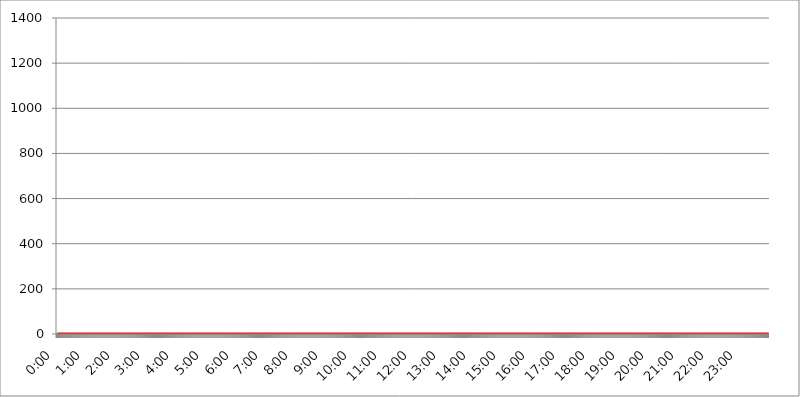
| Category | 2016.07.25. Intenzitás [W/m^2] |
|---|---|
| 0.0 | 0 |
| 0.0006944444444444445 | 0 |
| 0.001388888888888889 | 0 |
| 0.0020833333333333333 | 0 |
| 0.002777777777777778 | 0 |
| 0.003472222222222222 | 0 |
| 0.004166666666666667 | 0 |
| 0.004861111111111111 | 0 |
| 0.005555555555555556 | 0 |
| 0.0062499999999999995 | 0 |
| 0.006944444444444444 | 0 |
| 0.007638888888888889 | 0 |
| 0.008333333333333333 | 0 |
| 0.009027777777777779 | 0 |
| 0.009722222222222222 | 0 |
| 0.010416666666666666 | 0 |
| 0.011111111111111112 | 0 |
| 0.011805555555555555 | 0 |
| 0.012499999999999999 | 0 |
| 0.013194444444444444 | 0 |
| 0.013888888888888888 | 0 |
| 0.014583333333333332 | 0 |
| 0.015277777777777777 | 0 |
| 0.015972222222222224 | 0 |
| 0.016666666666666666 | 0 |
| 0.017361111111111112 | 0 |
| 0.018055555555555557 | 0 |
| 0.01875 | 0 |
| 0.019444444444444445 | 0 |
| 0.02013888888888889 | 0 |
| 0.020833333333333332 | 0 |
| 0.02152777777777778 | 0 |
| 0.022222222222222223 | 0 |
| 0.02291666666666667 | 0 |
| 0.02361111111111111 | 0 |
| 0.024305555555555556 | 0 |
| 0.024999999999999998 | 0 |
| 0.025694444444444447 | 0 |
| 0.02638888888888889 | 0 |
| 0.027083333333333334 | 0 |
| 0.027777777777777776 | 0 |
| 0.02847222222222222 | 0 |
| 0.029166666666666664 | 0 |
| 0.029861111111111113 | 0 |
| 0.030555555555555555 | 0 |
| 0.03125 | 0 |
| 0.03194444444444445 | 0 |
| 0.03263888888888889 | 0 |
| 0.03333333333333333 | 0 |
| 0.034027777777777775 | 0 |
| 0.034722222222222224 | 0 |
| 0.035416666666666666 | 0 |
| 0.036111111111111115 | 0 |
| 0.03680555555555556 | 0 |
| 0.0375 | 0 |
| 0.03819444444444444 | 0 |
| 0.03888888888888889 | 0 |
| 0.03958333333333333 | 0 |
| 0.04027777777777778 | 0 |
| 0.04097222222222222 | 0 |
| 0.041666666666666664 | 0 |
| 0.042361111111111106 | 0 |
| 0.04305555555555556 | 0 |
| 0.043750000000000004 | 0 |
| 0.044444444444444446 | 0 |
| 0.04513888888888889 | 0 |
| 0.04583333333333334 | 0 |
| 0.04652777777777778 | 0 |
| 0.04722222222222222 | 0 |
| 0.04791666666666666 | 0 |
| 0.04861111111111111 | 0 |
| 0.049305555555555554 | 0 |
| 0.049999999999999996 | 0 |
| 0.05069444444444445 | 0 |
| 0.051388888888888894 | 0 |
| 0.052083333333333336 | 0 |
| 0.05277777777777778 | 0 |
| 0.05347222222222222 | 0 |
| 0.05416666666666667 | 0 |
| 0.05486111111111111 | 0 |
| 0.05555555555555555 | 0 |
| 0.05625 | 0 |
| 0.05694444444444444 | 0 |
| 0.057638888888888885 | 0 |
| 0.05833333333333333 | 0 |
| 0.05902777777777778 | 0 |
| 0.059722222222222225 | 0 |
| 0.06041666666666667 | 0 |
| 0.061111111111111116 | 0 |
| 0.06180555555555556 | 0 |
| 0.0625 | 0 |
| 0.06319444444444444 | 0 |
| 0.06388888888888888 | 0 |
| 0.06458333333333334 | 0 |
| 0.06527777777777778 | 0 |
| 0.06597222222222222 | 0 |
| 0.06666666666666667 | 0 |
| 0.06736111111111111 | 0 |
| 0.06805555555555555 | 0 |
| 0.06874999999999999 | 0 |
| 0.06944444444444443 | 0 |
| 0.07013888888888889 | 0 |
| 0.07083333333333333 | 0 |
| 0.07152777777777779 | 0 |
| 0.07222222222222223 | 0 |
| 0.07291666666666667 | 0 |
| 0.07361111111111111 | 0 |
| 0.07430555555555556 | 0 |
| 0.075 | 0 |
| 0.07569444444444444 | 0 |
| 0.0763888888888889 | 0 |
| 0.07708333333333334 | 0 |
| 0.07777777777777778 | 0 |
| 0.07847222222222222 | 0 |
| 0.07916666666666666 | 0 |
| 0.0798611111111111 | 0 |
| 0.08055555555555556 | 0 |
| 0.08125 | 0 |
| 0.08194444444444444 | 0 |
| 0.08263888888888889 | 0 |
| 0.08333333333333333 | 0 |
| 0.08402777777777777 | 0 |
| 0.08472222222222221 | 0 |
| 0.08541666666666665 | 0 |
| 0.08611111111111112 | 0 |
| 0.08680555555555557 | 0 |
| 0.08750000000000001 | 0 |
| 0.08819444444444445 | 0 |
| 0.08888888888888889 | 0 |
| 0.08958333333333333 | 0 |
| 0.09027777777777778 | 0 |
| 0.09097222222222222 | 0 |
| 0.09166666666666667 | 0 |
| 0.09236111111111112 | 0 |
| 0.09305555555555556 | 0 |
| 0.09375 | 0 |
| 0.09444444444444444 | 0 |
| 0.09513888888888888 | 0 |
| 0.09583333333333333 | 0 |
| 0.09652777777777777 | 0 |
| 0.09722222222222222 | 0 |
| 0.09791666666666667 | 0 |
| 0.09861111111111111 | 0 |
| 0.09930555555555555 | 0 |
| 0.09999999999999999 | 0 |
| 0.10069444444444443 | 0 |
| 0.1013888888888889 | 0 |
| 0.10208333333333335 | 0 |
| 0.10277777777777779 | 0 |
| 0.10347222222222223 | 0 |
| 0.10416666666666667 | 0 |
| 0.10486111111111111 | 0 |
| 0.10555555555555556 | 0 |
| 0.10625 | 0 |
| 0.10694444444444444 | 0 |
| 0.1076388888888889 | 0 |
| 0.10833333333333334 | 0 |
| 0.10902777777777778 | 0 |
| 0.10972222222222222 | 0 |
| 0.1111111111111111 | 0 |
| 0.11180555555555556 | 0 |
| 0.11180555555555556 | 0 |
| 0.1125 | 0 |
| 0.11319444444444444 | 0 |
| 0.11388888888888889 | 0 |
| 0.11458333333333333 | 0 |
| 0.11527777777777777 | 0 |
| 0.11597222222222221 | 0 |
| 0.11666666666666665 | 0 |
| 0.1173611111111111 | 0 |
| 0.11805555555555557 | 0 |
| 0.11944444444444445 | 0 |
| 0.12013888888888889 | 0 |
| 0.12083333333333333 | 0 |
| 0.12152777777777778 | 0 |
| 0.12222222222222223 | 0 |
| 0.12291666666666667 | 0 |
| 0.12291666666666667 | 0 |
| 0.12361111111111112 | 0 |
| 0.12430555555555556 | 0 |
| 0.125 | 0 |
| 0.12569444444444444 | 0 |
| 0.12638888888888888 | 0 |
| 0.12708333333333333 | 0 |
| 0.16875 | 0 |
| 0.12847222222222224 | 0 |
| 0.12916666666666668 | 0 |
| 0.12986111111111112 | 0 |
| 0.13055555555555556 | 0 |
| 0.13125 | 0 |
| 0.13194444444444445 | 0 |
| 0.1326388888888889 | 0 |
| 0.13333333333333333 | 0 |
| 0.13402777777777777 | 0 |
| 0.13402777777777777 | 0 |
| 0.13472222222222222 | 0 |
| 0.13541666666666666 | 0 |
| 0.1361111111111111 | 0 |
| 0.13749999999999998 | 0 |
| 0.13819444444444443 | 0 |
| 0.1388888888888889 | 0 |
| 0.13958333333333334 | 0 |
| 0.14027777777777778 | 0 |
| 0.14097222222222222 | 0 |
| 0.14166666666666666 | 0 |
| 0.1423611111111111 | 0 |
| 0.14305555555555557 | 0 |
| 0.14375000000000002 | 0 |
| 0.14444444444444446 | 0 |
| 0.1451388888888889 | 0 |
| 0.1451388888888889 | 0 |
| 0.14652777777777778 | 0 |
| 0.14722222222222223 | 0 |
| 0.14791666666666667 | 0 |
| 0.1486111111111111 | 0 |
| 0.14930555555555555 | 0 |
| 0.15 | 0 |
| 0.15069444444444444 | 0 |
| 0.15138888888888888 | 0 |
| 0.15208333333333332 | 0 |
| 0.15277777777777776 | 0 |
| 0.15347222222222223 | 0 |
| 0.15416666666666667 | 0 |
| 0.15486111111111112 | 0 |
| 0.15555555555555556 | 0 |
| 0.15625 | 0 |
| 0.15694444444444444 | 0 |
| 0.15763888888888888 | 0 |
| 0.15833333333333333 | 0 |
| 0.15902777777777777 | 0 |
| 0.15972222222222224 | 0 |
| 0.16041666666666668 | 0 |
| 0.16111111111111112 | 0 |
| 0.16180555555555556 | 0 |
| 0.1625 | 0 |
| 0.16319444444444445 | 0 |
| 0.1638888888888889 | 0 |
| 0.16458333333333333 | 0 |
| 0.16527777777777777 | 0 |
| 0.16597222222222222 | 0 |
| 0.16666666666666666 | 0 |
| 0.1673611111111111 | 0 |
| 0.16805555555555554 | 0 |
| 0.16874999999999998 | 0 |
| 0.16944444444444443 | 0 |
| 0.17013888888888887 | 0 |
| 0.1708333333333333 | 0 |
| 0.17152777777777775 | 0 |
| 0.17222222222222225 | 0 |
| 0.1729166666666667 | 0 |
| 0.17361111111111113 | 0 |
| 0.17430555555555557 | 0 |
| 0.17500000000000002 | 0 |
| 0.17569444444444446 | 0 |
| 0.1763888888888889 | 0 |
| 0.17708333333333334 | 0 |
| 0.17777777777777778 | 0 |
| 0.17847222222222223 | 0 |
| 0.17916666666666667 | 0 |
| 0.1798611111111111 | 0 |
| 0.18055555555555555 | 0 |
| 0.18125 | 0 |
| 0.18194444444444444 | 0 |
| 0.1826388888888889 | 0 |
| 0.18333333333333335 | 0 |
| 0.1840277777777778 | 0 |
| 0.18472222222222223 | 0 |
| 0.18541666666666667 | 0 |
| 0.18611111111111112 | 0 |
| 0.18680555555555556 | 0 |
| 0.1875 | 0 |
| 0.18819444444444444 | 0 |
| 0.18888888888888888 | 0 |
| 0.18958333333333333 | 0 |
| 0.19027777777777777 | 0 |
| 0.1909722222222222 | 0 |
| 0.19166666666666665 | 0 |
| 0.19236111111111112 | 0 |
| 0.19305555555555554 | 0 |
| 0.19375 | 0 |
| 0.19444444444444445 | 0 |
| 0.1951388888888889 | 0 |
| 0.19583333333333333 | 0 |
| 0.19652777777777777 | 0 |
| 0.19722222222222222 | 0 |
| 0.19791666666666666 | 0 |
| 0.1986111111111111 | 0 |
| 0.19930555555555554 | 0 |
| 0.19999999999999998 | 0 |
| 0.20069444444444443 | 0 |
| 0.20138888888888887 | 0 |
| 0.2020833333333333 | 0 |
| 0.2027777777777778 | 0 |
| 0.2034722222222222 | 0 |
| 0.2041666666666667 | 0 |
| 0.20486111111111113 | 0 |
| 0.20555555555555557 | 0 |
| 0.20625000000000002 | 0 |
| 0.20694444444444446 | 0 |
| 0.2076388888888889 | 0 |
| 0.20833333333333334 | 0 |
| 0.20902777777777778 | 0 |
| 0.20972222222222223 | 0 |
| 0.21041666666666667 | 0 |
| 0.2111111111111111 | 0 |
| 0.21180555555555555 | 0 |
| 0.2125 | 0 |
| 0.21319444444444444 | 0 |
| 0.2138888888888889 | 0 |
| 0.21458333333333335 | 0 |
| 0.2152777777777778 | 0 |
| 0.21597222222222223 | 0 |
| 0.21666666666666667 | 0 |
| 0.21736111111111112 | 0 |
| 0.21805555555555556 | 0 |
| 0.21875 | 0 |
| 0.21944444444444444 | 0 |
| 0.22013888888888888 | 0 |
| 0.22083333333333333 | 0 |
| 0.22152777777777777 | 0 |
| 0.2222222222222222 | 0 |
| 0.22291666666666665 | 0 |
| 0.2236111111111111 | 0 |
| 0.22430555555555556 | 0 |
| 0.225 | 0 |
| 0.22569444444444445 | 0 |
| 0.2263888888888889 | 0 |
| 0.22708333333333333 | 0 |
| 0.22777777777777777 | 0 |
| 0.22847222222222222 | 0 |
| 0.22916666666666666 | 0 |
| 0.2298611111111111 | 0 |
| 0.23055555555555554 | 0 |
| 0.23124999999999998 | 0 |
| 0.23194444444444443 | 0 |
| 0.23263888888888887 | 0 |
| 0.2333333333333333 | 0 |
| 0.2340277777777778 | 0 |
| 0.2347222222222222 | 0 |
| 0.2354166666666667 | 0 |
| 0.23611111111111113 | 0 |
| 0.23680555555555557 | 0 |
| 0.23750000000000002 | 0 |
| 0.23819444444444446 | 0 |
| 0.2388888888888889 | 0 |
| 0.23958333333333334 | 0 |
| 0.24027777777777778 | 0 |
| 0.24097222222222223 | 0 |
| 0.24166666666666667 | 0 |
| 0.2423611111111111 | 0 |
| 0.24305555555555555 | 0 |
| 0.24375 | 0 |
| 0.24444444444444446 | 0 |
| 0.24513888888888888 | 0 |
| 0.24583333333333335 | 0 |
| 0.2465277777777778 | 0 |
| 0.24722222222222223 | 0 |
| 0.24791666666666667 | 0 |
| 0.24861111111111112 | 0 |
| 0.24930555555555556 | 0 |
| 0.25 | 0 |
| 0.25069444444444444 | 0 |
| 0.2513888888888889 | 0 |
| 0.2520833333333333 | 0 |
| 0.25277777777777777 | 0 |
| 0.2534722222222222 | 0 |
| 0.25416666666666665 | 0 |
| 0.2548611111111111 | 0 |
| 0.2555555555555556 | 0 |
| 0.25625000000000003 | 0 |
| 0.2569444444444445 | 0 |
| 0.2576388888888889 | 0 |
| 0.25833333333333336 | 0 |
| 0.2590277777777778 | 0 |
| 0.25972222222222224 | 0 |
| 0.2604166666666667 | 0 |
| 0.2611111111111111 | 0 |
| 0.26180555555555557 | 0 |
| 0.2625 | 0 |
| 0.26319444444444445 | 0 |
| 0.2638888888888889 | 0 |
| 0.26458333333333334 | 0 |
| 0.2652777777777778 | 0 |
| 0.2659722222222222 | 0 |
| 0.26666666666666666 | 0 |
| 0.2673611111111111 | 0 |
| 0.26805555555555555 | 0 |
| 0.26875 | 0 |
| 0.26944444444444443 | 0 |
| 0.2701388888888889 | 0 |
| 0.2708333333333333 | 0 |
| 0.27152777777777776 | 0 |
| 0.2722222222222222 | 0 |
| 0.27291666666666664 | 0 |
| 0.2736111111111111 | 0 |
| 0.2743055555555555 | 0 |
| 0.27499999999999997 | 0 |
| 0.27569444444444446 | 0 |
| 0.27638888888888885 | 0 |
| 0.27708333333333335 | 0 |
| 0.2777777777777778 | 0 |
| 0.27847222222222223 | 0 |
| 0.2791666666666667 | 0 |
| 0.2798611111111111 | 0 |
| 0.28055555555555556 | 0 |
| 0.28125 | 0 |
| 0.28194444444444444 | 0 |
| 0.2826388888888889 | 0 |
| 0.2833333333333333 | 0 |
| 0.28402777777777777 | 0 |
| 0.2847222222222222 | 0 |
| 0.28541666666666665 | 0 |
| 0.28611111111111115 | 0 |
| 0.28680555555555554 | 0 |
| 0.28750000000000003 | 0 |
| 0.2881944444444445 | 0 |
| 0.2888888888888889 | 0 |
| 0.28958333333333336 | 0 |
| 0.2902777777777778 | 0 |
| 0.29097222222222224 | 0 |
| 0.2916666666666667 | 0 |
| 0.2923611111111111 | 0 |
| 0.29305555555555557 | 0 |
| 0.29375 | 0 |
| 0.29444444444444445 | 0 |
| 0.2951388888888889 | 0 |
| 0.29583333333333334 | 0 |
| 0.2965277777777778 | 0 |
| 0.2972222222222222 | 0 |
| 0.29791666666666666 | 0 |
| 0.2986111111111111 | 0 |
| 0.29930555555555555 | 0 |
| 0.3 | 0 |
| 0.30069444444444443 | 0 |
| 0.3013888888888889 | 0 |
| 0.3020833333333333 | 0 |
| 0.30277777777777776 | 0 |
| 0.3034722222222222 | 0 |
| 0.30416666666666664 | 0 |
| 0.3048611111111111 | 0 |
| 0.3055555555555555 | 0 |
| 0.30624999999999997 | 0 |
| 0.3069444444444444 | 0 |
| 0.3076388888888889 | 0 |
| 0.30833333333333335 | 0 |
| 0.3090277777777778 | 0 |
| 0.30972222222222223 | 0 |
| 0.3104166666666667 | 0 |
| 0.3111111111111111 | 0 |
| 0.31180555555555556 | 0 |
| 0.3125 | 0 |
| 0.31319444444444444 | 0 |
| 0.3138888888888889 | 0 |
| 0.3145833333333333 | 0 |
| 0.31527777777777777 | 0 |
| 0.3159722222222222 | 0 |
| 0.31666666666666665 | 0 |
| 0.31736111111111115 | 0 |
| 0.31805555555555554 | 0 |
| 0.31875000000000003 | 0 |
| 0.3194444444444445 | 0 |
| 0.3201388888888889 | 0 |
| 0.32083333333333336 | 0 |
| 0.3215277777777778 | 0 |
| 0.32222222222222224 | 0 |
| 0.3229166666666667 | 0 |
| 0.3236111111111111 | 0 |
| 0.32430555555555557 | 0 |
| 0.325 | 0 |
| 0.32569444444444445 | 0 |
| 0.3263888888888889 | 0 |
| 0.32708333333333334 | 0 |
| 0.3277777777777778 | 0 |
| 0.3284722222222222 | 0 |
| 0.32916666666666666 | 0 |
| 0.3298611111111111 | 0 |
| 0.33055555555555555 | 0 |
| 0.33125 | 0 |
| 0.33194444444444443 | 0 |
| 0.3326388888888889 | 0 |
| 0.3333333333333333 | 0 |
| 0.3340277777777778 | 0 |
| 0.3347222222222222 | 0 |
| 0.3354166666666667 | 0 |
| 0.3361111111111111 | 0 |
| 0.3368055555555556 | 0 |
| 0.33749999999999997 | 0 |
| 0.33819444444444446 | 0 |
| 0.33888888888888885 | 0 |
| 0.33958333333333335 | 0 |
| 0.34027777777777773 | 0 |
| 0.34097222222222223 | 0 |
| 0.3416666666666666 | 0 |
| 0.3423611111111111 | 0 |
| 0.3430555555555555 | 0 |
| 0.34375 | 0 |
| 0.3444444444444445 | 0 |
| 0.3451388888888889 | 0 |
| 0.3458333333333334 | 0 |
| 0.34652777777777777 | 0 |
| 0.34722222222222227 | 0 |
| 0.34791666666666665 | 0 |
| 0.34861111111111115 | 0 |
| 0.34930555555555554 | 0 |
| 0.35000000000000003 | 0 |
| 0.3506944444444444 | 0 |
| 0.3513888888888889 | 0 |
| 0.3520833333333333 | 0 |
| 0.3527777777777778 | 0 |
| 0.3534722222222222 | 0 |
| 0.3541666666666667 | 0 |
| 0.3548611111111111 | 0 |
| 0.35555555555555557 | 0 |
| 0.35625 | 0 |
| 0.35694444444444445 | 0 |
| 0.3576388888888889 | 0 |
| 0.35833333333333334 | 0 |
| 0.3590277777777778 | 0 |
| 0.3597222222222222 | 0 |
| 0.36041666666666666 | 0 |
| 0.3611111111111111 | 0 |
| 0.36180555555555555 | 0 |
| 0.3625 | 0 |
| 0.36319444444444443 | 0 |
| 0.3638888888888889 | 0 |
| 0.3645833333333333 | 0 |
| 0.3652777777777778 | 0 |
| 0.3659722222222222 | 0 |
| 0.3666666666666667 | 0 |
| 0.3673611111111111 | 0 |
| 0.3680555555555556 | 0 |
| 0.36874999999999997 | 0 |
| 0.36944444444444446 | 0 |
| 0.37013888888888885 | 0 |
| 0.37083333333333335 | 0 |
| 0.37152777777777773 | 0 |
| 0.37222222222222223 | 0 |
| 0.3729166666666666 | 0 |
| 0.3736111111111111 | 0 |
| 0.3743055555555555 | 0 |
| 0.375 | 0 |
| 0.3756944444444445 | 0 |
| 0.3763888888888889 | 0 |
| 0.3770833333333334 | 0 |
| 0.37777777777777777 | 0 |
| 0.37847222222222227 | 0 |
| 0.37916666666666665 | 0 |
| 0.37986111111111115 | 0 |
| 0.38055555555555554 | 0 |
| 0.38125000000000003 | 0 |
| 0.3819444444444444 | 0 |
| 0.3826388888888889 | 0 |
| 0.3833333333333333 | 0 |
| 0.3840277777777778 | 0 |
| 0.3847222222222222 | 0 |
| 0.3854166666666667 | 0 |
| 0.3861111111111111 | 0 |
| 0.38680555555555557 | 0 |
| 0.3875 | 0 |
| 0.38819444444444445 | 0 |
| 0.3888888888888889 | 0 |
| 0.38958333333333334 | 0 |
| 0.3902777777777778 | 0 |
| 0.3909722222222222 | 0 |
| 0.39166666666666666 | 0 |
| 0.3923611111111111 | 0 |
| 0.39305555555555555 | 0 |
| 0.39375 | 0 |
| 0.39444444444444443 | 0 |
| 0.3951388888888889 | 0 |
| 0.3958333333333333 | 0 |
| 0.3965277777777778 | 0 |
| 0.3972222222222222 | 0 |
| 0.3979166666666667 | 0 |
| 0.3986111111111111 | 0 |
| 0.3993055555555556 | 0 |
| 0.39999999999999997 | 0 |
| 0.40069444444444446 | 0 |
| 0.40138888888888885 | 0 |
| 0.40208333333333335 | 0 |
| 0.40277777777777773 | 0 |
| 0.40347222222222223 | 0 |
| 0.4041666666666666 | 0 |
| 0.4048611111111111 | 0 |
| 0.4055555555555555 | 0 |
| 0.40625 | 0 |
| 0.4069444444444445 | 0 |
| 0.4076388888888889 | 0 |
| 0.4083333333333334 | 0 |
| 0.40902777777777777 | 0 |
| 0.40972222222222227 | 0 |
| 0.41041666666666665 | 0 |
| 0.41111111111111115 | 0 |
| 0.41180555555555554 | 0 |
| 0.41250000000000003 | 0 |
| 0.4131944444444444 | 0 |
| 0.4138888888888889 | 0 |
| 0.4145833333333333 | 0 |
| 0.4152777777777778 | 0 |
| 0.4159722222222222 | 0 |
| 0.4166666666666667 | 0 |
| 0.4173611111111111 | 0 |
| 0.41805555555555557 | 0 |
| 0.41875 | 0 |
| 0.41944444444444445 | 0 |
| 0.4201388888888889 | 0 |
| 0.42083333333333334 | 0 |
| 0.4215277777777778 | 0 |
| 0.4222222222222222 | 0 |
| 0.42291666666666666 | 0 |
| 0.4236111111111111 | 0 |
| 0.42430555555555555 | 0 |
| 0.425 | 0 |
| 0.42569444444444443 | 0 |
| 0.4263888888888889 | 0 |
| 0.4270833333333333 | 0 |
| 0.4277777777777778 | 0 |
| 0.4284722222222222 | 0 |
| 0.4291666666666667 | 0 |
| 0.4298611111111111 | 0 |
| 0.4305555555555556 | 0 |
| 0.43124999999999997 | 0 |
| 0.43194444444444446 | 0 |
| 0.43263888888888885 | 0 |
| 0.43333333333333335 | 0 |
| 0.43402777777777773 | 0 |
| 0.43472222222222223 | 0 |
| 0.4354166666666666 | 0 |
| 0.4361111111111111 | 0 |
| 0.4368055555555555 | 0 |
| 0.4375 | 0 |
| 0.4381944444444445 | 0 |
| 0.4388888888888889 | 0 |
| 0.4395833333333334 | 0 |
| 0.44027777777777777 | 0 |
| 0.44097222222222227 | 0 |
| 0.44166666666666665 | 0 |
| 0.44236111111111115 | 0 |
| 0.44305555555555554 | 0 |
| 0.44375000000000003 | 0 |
| 0.4444444444444444 | 0 |
| 0.4451388888888889 | 0 |
| 0.4458333333333333 | 0 |
| 0.4465277777777778 | 0 |
| 0.4472222222222222 | 0 |
| 0.4479166666666667 | 0 |
| 0.4486111111111111 | 0 |
| 0.44930555555555557 | 0 |
| 0.45 | 0 |
| 0.45069444444444445 | 0 |
| 0.4513888888888889 | 0 |
| 0.45208333333333334 | 0 |
| 0.4527777777777778 | 0 |
| 0.4534722222222222 | 0 |
| 0.45416666666666666 | 0 |
| 0.4548611111111111 | 0 |
| 0.45555555555555555 | 0 |
| 0.45625 | 0 |
| 0.45694444444444443 | 0 |
| 0.4576388888888889 | 0 |
| 0.4583333333333333 | 0 |
| 0.4590277777777778 | 0 |
| 0.4597222222222222 | 0 |
| 0.4604166666666667 | 0 |
| 0.4611111111111111 | 0 |
| 0.4618055555555556 | 0 |
| 0.46249999999999997 | 0 |
| 0.46319444444444446 | 0 |
| 0.46388888888888885 | 0 |
| 0.46458333333333335 | 0 |
| 0.46527777777777773 | 0 |
| 0.46597222222222223 | 0 |
| 0.4666666666666666 | 0 |
| 0.4673611111111111 | 0 |
| 0.4680555555555555 | 0 |
| 0.46875 | 0 |
| 0.4694444444444445 | 0 |
| 0.4701388888888889 | 0 |
| 0.4708333333333334 | 0 |
| 0.47152777777777777 | 0 |
| 0.47222222222222227 | 0 |
| 0.47291666666666665 | 0 |
| 0.47361111111111115 | 0 |
| 0.47430555555555554 | 0 |
| 0.47500000000000003 | 0 |
| 0.4756944444444444 | 0 |
| 0.4763888888888889 | 0 |
| 0.4770833333333333 | 0 |
| 0.4777777777777778 | 0 |
| 0.4784722222222222 | 0 |
| 0.4791666666666667 | 0 |
| 0.4798611111111111 | 0 |
| 0.48055555555555557 | 0 |
| 0.48125 | 0 |
| 0.48194444444444445 | 0 |
| 0.4826388888888889 | 0 |
| 0.48333333333333334 | 0 |
| 0.4840277777777778 | 0 |
| 0.4847222222222222 | 0 |
| 0.48541666666666666 | 0 |
| 0.4861111111111111 | 0 |
| 0.48680555555555555 | 0 |
| 0.4875 | 0 |
| 0.48819444444444443 | 0 |
| 0.4888888888888889 | 0 |
| 0.4895833333333333 | 0 |
| 0.4902777777777778 | 0 |
| 0.4909722222222222 | 0 |
| 0.4916666666666667 | 0 |
| 0.4923611111111111 | 0 |
| 0.4930555555555556 | 0 |
| 0.49374999999999997 | 0 |
| 0.49444444444444446 | 0 |
| 0.49513888888888885 | 0 |
| 0.49583333333333335 | 0 |
| 0.49652777777777773 | 0 |
| 0.49722222222222223 | 0 |
| 0.4979166666666666 | 0 |
| 0.4986111111111111 | 0 |
| 0.4993055555555555 | 0 |
| 0.5 | 0 |
| 0.5006944444444444 | 0 |
| 0.5013888888888889 | 0 |
| 0.5020833333333333 | 0 |
| 0.5027777777777778 | 0 |
| 0.5034722222222222 | 0 |
| 0.5041666666666667 | 0 |
| 0.5048611111111111 | 0 |
| 0.5055555555555555 | 0 |
| 0.50625 | 0 |
| 0.5069444444444444 | 0 |
| 0.5076388888888889 | 0 |
| 0.5083333333333333 | 0 |
| 0.5090277777777777 | 0 |
| 0.5097222222222222 | 0 |
| 0.5104166666666666 | 0 |
| 0.5111111111111112 | 0 |
| 0.5118055555555555 | 0 |
| 0.5125000000000001 | 0 |
| 0.5131944444444444 | 0 |
| 0.513888888888889 | 0 |
| 0.5145833333333333 | 0 |
| 0.5152777777777778 | 0 |
| 0.5159722222222222 | 0 |
| 0.5166666666666667 | 0 |
| 0.517361111111111 | 0 |
| 0.5180555555555556 | 0 |
| 0.5187499999999999 | 0 |
| 0.5194444444444445 | 0 |
| 0.5201388888888888 | 0 |
| 0.5208333333333334 | 0 |
| 0.5215277777777778 | 0 |
| 0.5222222222222223 | 0 |
| 0.5229166666666667 | 0 |
| 0.5236111111111111 | 0 |
| 0.5243055555555556 | 0 |
| 0.525 | 0 |
| 0.5256944444444445 | 0 |
| 0.5263888888888889 | 0 |
| 0.5270833333333333 | 0 |
| 0.5277777777777778 | 0 |
| 0.5284722222222222 | 0 |
| 0.5291666666666667 | 0 |
| 0.5298611111111111 | 0 |
| 0.5305555555555556 | 0 |
| 0.53125 | 0 |
| 0.5319444444444444 | 0 |
| 0.5326388888888889 | 0 |
| 0.5333333333333333 | 0 |
| 0.5340277777777778 | 0 |
| 0.5347222222222222 | 0 |
| 0.5354166666666667 | 0 |
| 0.5361111111111111 | 0 |
| 0.5368055555555555 | 0 |
| 0.5375 | 0 |
| 0.5381944444444444 | 0 |
| 0.5388888888888889 | 0 |
| 0.5395833333333333 | 0 |
| 0.5402777777777777 | 0 |
| 0.5409722222222222 | 0 |
| 0.5416666666666666 | 0 |
| 0.5423611111111112 | 0 |
| 0.5430555555555555 | 0 |
| 0.5437500000000001 | 0 |
| 0.5444444444444444 | 0 |
| 0.545138888888889 | 0 |
| 0.5458333333333333 | 0 |
| 0.5465277777777778 | 0 |
| 0.5472222222222222 | 0 |
| 0.5479166666666667 | 0 |
| 0.548611111111111 | 0 |
| 0.5493055555555556 | 0 |
| 0.5499999999999999 | 0 |
| 0.5506944444444445 | 0 |
| 0.5513888888888888 | 0 |
| 0.5520833333333334 | 0 |
| 0.5527777777777778 | 0 |
| 0.5534722222222223 | 0 |
| 0.5541666666666667 | 0 |
| 0.5548611111111111 | 0 |
| 0.5555555555555556 | 0 |
| 0.55625 | 0 |
| 0.5569444444444445 | 0 |
| 0.5576388888888889 | 0 |
| 0.5583333333333333 | 0 |
| 0.5590277777777778 | 0 |
| 0.5597222222222222 | 0 |
| 0.5604166666666667 | 0 |
| 0.5611111111111111 | 0 |
| 0.5618055555555556 | 0 |
| 0.5625 | 0 |
| 0.5631944444444444 | 0 |
| 0.5638888888888889 | 0 |
| 0.5645833333333333 | 0 |
| 0.5652777777777778 | 0 |
| 0.5659722222222222 | 0 |
| 0.5666666666666667 | 0 |
| 0.5673611111111111 | 0 |
| 0.5680555555555555 | 0 |
| 0.56875 | 0 |
| 0.5694444444444444 | 0 |
| 0.5701388888888889 | 0 |
| 0.5708333333333333 | 0 |
| 0.5715277777777777 | 0 |
| 0.5722222222222222 | 0 |
| 0.5729166666666666 | 0 |
| 0.5736111111111112 | 0 |
| 0.5743055555555555 | 0 |
| 0.5750000000000001 | 0 |
| 0.5756944444444444 | 0 |
| 0.576388888888889 | 0 |
| 0.5770833333333333 | 0 |
| 0.5777777777777778 | 0 |
| 0.5784722222222222 | 0 |
| 0.5791666666666667 | 0 |
| 0.579861111111111 | 0 |
| 0.5805555555555556 | 0 |
| 0.5812499999999999 | 0 |
| 0.5819444444444445 | 0 |
| 0.5826388888888888 | 0 |
| 0.5833333333333334 | 0 |
| 0.5840277777777778 | 0 |
| 0.5847222222222223 | 0 |
| 0.5854166666666667 | 0 |
| 0.5861111111111111 | 0 |
| 0.5868055555555556 | 0 |
| 0.5875 | 0 |
| 0.5881944444444445 | 0 |
| 0.5888888888888889 | 0 |
| 0.5895833333333333 | 0 |
| 0.5902777777777778 | 0 |
| 0.5909722222222222 | 0 |
| 0.5916666666666667 | 0 |
| 0.5923611111111111 | 0 |
| 0.5930555555555556 | 0 |
| 0.59375 | 0 |
| 0.5944444444444444 | 0 |
| 0.5951388888888889 | 0 |
| 0.5958333333333333 | 0 |
| 0.5965277777777778 | 0 |
| 0.5972222222222222 | 0 |
| 0.5979166666666667 | 0 |
| 0.5986111111111111 | 0 |
| 0.5993055555555555 | 0 |
| 0.6 | 0 |
| 0.6006944444444444 | 0 |
| 0.6013888888888889 | 0 |
| 0.6020833333333333 | 0 |
| 0.6027777777777777 | 0 |
| 0.6034722222222222 | 0 |
| 0.6041666666666666 | 0 |
| 0.6048611111111112 | 0 |
| 0.6055555555555555 | 0 |
| 0.6062500000000001 | 0 |
| 0.6069444444444444 | 0 |
| 0.607638888888889 | 0 |
| 0.6083333333333333 | 0 |
| 0.6090277777777778 | 0 |
| 0.6097222222222222 | 0 |
| 0.6104166666666667 | 0 |
| 0.611111111111111 | 0 |
| 0.6118055555555556 | 0 |
| 0.6124999999999999 | 0 |
| 0.6131944444444445 | 0 |
| 0.6138888888888888 | 0 |
| 0.6145833333333334 | 0 |
| 0.6152777777777778 | 0 |
| 0.6159722222222223 | 0 |
| 0.6166666666666667 | 0 |
| 0.6173611111111111 | 0 |
| 0.6180555555555556 | 0 |
| 0.61875 | 0 |
| 0.6194444444444445 | 0 |
| 0.6201388888888889 | 0 |
| 0.6208333333333333 | 0 |
| 0.6215277777777778 | 0 |
| 0.6222222222222222 | 0 |
| 0.6229166666666667 | 0 |
| 0.6236111111111111 | 0 |
| 0.6243055555555556 | 0 |
| 0.625 | 0 |
| 0.6256944444444444 | 0 |
| 0.6263888888888889 | 0 |
| 0.6270833333333333 | 0 |
| 0.6277777777777778 | 0 |
| 0.6284722222222222 | 0 |
| 0.6291666666666667 | 0 |
| 0.6298611111111111 | 0 |
| 0.6305555555555555 | 0 |
| 0.63125 | 0 |
| 0.6319444444444444 | 0 |
| 0.6326388888888889 | 0 |
| 0.6333333333333333 | 0 |
| 0.6340277777777777 | 0 |
| 0.6347222222222222 | 0 |
| 0.6354166666666666 | 0 |
| 0.6361111111111112 | 0 |
| 0.6368055555555555 | 0 |
| 0.6375000000000001 | 0 |
| 0.6381944444444444 | 0 |
| 0.638888888888889 | 0 |
| 0.6395833333333333 | 0 |
| 0.6402777777777778 | 0 |
| 0.6409722222222222 | 0 |
| 0.6416666666666667 | 0 |
| 0.642361111111111 | 0 |
| 0.6430555555555556 | 0 |
| 0.6437499999999999 | 0 |
| 0.6444444444444445 | 0 |
| 0.6451388888888888 | 0 |
| 0.6458333333333334 | 0 |
| 0.6465277777777778 | 0 |
| 0.6472222222222223 | 0 |
| 0.6479166666666667 | 0 |
| 0.6486111111111111 | 0 |
| 0.6493055555555556 | 0 |
| 0.65 | 0 |
| 0.6506944444444445 | 0 |
| 0.6513888888888889 | 0 |
| 0.6520833333333333 | 0 |
| 0.6527777777777778 | 0 |
| 0.6534722222222222 | 0 |
| 0.6541666666666667 | 0 |
| 0.6548611111111111 | 0 |
| 0.6555555555555556 | 0 |
| 0.65625 | 0 |
| 0.6569444444444444 | 0 |
| 0.6576388888888889 | 0 |
| 0.6583333333333333 | 0 |
| 0.6590277777777778 | 0 |
| 0.6597222222222222 | 0 |
| 0.6604166666666667 | 0 |
| 0.6611111111111111 | 0 |
| 0.6618055555555555 | 0 |
| 0.6625 | 0 |
| 0.6631944444444444 | 0 |
| 0.6638888888888889 | 0 |
| 0.6645833333333333 | 0 |
| 0.6652777777777777 | 0 |
| 0.6659722222222222 | 0 |
| 0.6666666666666666 | 0 |
| 0.6673611111111111 | 0 |
| 0.6680555555555556 | 0 |
| 0.6687500000000001 | 0 |
| 0.6694444444444444 | 0 |
| 0.6701388888888888 | 0 |
| 0.6708333333333334 | 0 |
| 0.6715277777777778 | 0 |
| 0.6722222222222222 | 0 |
| 0.6729166666666666 | 0 |
| 0.6736111111111112 | 0 |
| 0.6743055555555556 | 0 |
| 0.6749999999999999 | 0 |
| 0.6756944444444444 | 0 |
| 0.6763888888888889 | 0 |
| 0.6770833333333334 | 0 |
| 0.6777777777777777 | 0 |
| 0.6784722222222223 | 0 |
| 0.6791666666666667 | 0 |
| 0.6798611111111111 | 0 |
| 0.6805555555555555 | 0 |
| 0.68125 | 0 |
| 0.6819444444444445 | 0 |
| 0.6826388888888889 | 0 |
| 0.6833333333333332 | 0 |
| 0.6840277777777778 | 0 |
| 0.6847222222222222 | 0 |
| 0.6854166666666667 | 0 |
| 0.686111111111111 | 0 |
| 0.6868055555555556 | 0 |
| 0.6875 | 0 |
| 0.6881944444444444 | 0 |
| 0.688888888888889 | 0 |
| 0.6895833333333333 | 0 |
| 0.6902777777777778 | 0 |
| 0.6909722222222222 | 0 |
| 0.6916666666666668 | 0 |
| 0.6923611111111111 | 0 |
| 0.6930555555555555 | 0 |
| 0.69375 | 0 |
| 0.6944444444444445 | 0 |
| 0.6951388888888889 | 0 |
| 0.6958333333333333 | 0 |
| 0.6965277777777777 | 0 |
| 0.6972222222222223 | 0 |
| 0.6979166666666666 | 0 |
| 0.6986111111111111 | 0 |
| 0.6993055555555556 | 0 |
| 0.7000000000000001 | 0 |
| 0.7006944444444444 | 0 |
| 0.7013888888888888 | 0 |
| 0.7020833333333334 | 0 |
| 0.7027777777777778 | 0 |
| 0.7034722222222222 | 0 |
| 0.7041666666666666 | 0 |
| 0.7048611111111112 | 0 |
| 0.7055555555555556 | 0 |
| 0.7062499999999999 | 0 |
| 0.7069444444444444 | 0 |
| 0.7076388888888889 | 0 |
| 0.7083333333333334 | 0 |
| 0.7090277777777777 | 0 |
| 0.7097222222222223 | 0 |
| 0.7104166666666667 | 0 |
| 0.7111111111111111 | 0 |
| 0.7118055555555555 | 0 |
| 0.7125 | 0 |
| 0.7131944444444445 | 0 |
| 0.7138888888888889 | 0 |
| 0.7145833333333332 | 0 |
| 0.7152777777777778 | 0 |
| 0.7159722222222222 | 0 |
| 0.7166666666666667 | 0 |
| 0.717361111111111 | 0 |
| 0.7180555555555556 | 0 |
| 0.71875 | 0 |
| 0.7194444444444444 | 0 |
| 0.720138888888889 | 0 |
| 0.7208333333333333 | 0 |
| 0.7215277777777778 | 0 |
| 0.7222222222222222 | 0 |
| 0.7229166666666668 | 0 |
| 0.7236111111111111 | 0 |
| 0.7243055555555555 | 0 |
| 0.725 | 0 |
| 0.7256944444444445 | 0 |
| 0.7263888888888889 | 0 |
| 0.7270833333333333 | 0 |
| 0.7277777777777777 | 0 |
| 0.7284722222222223 | 0 |
| 0.7291666666666666 | 0 |
| 0.7298611111111111 | 0 |
| 0.7305555555555556 | 0 |
| 0.7312500000000001 | 0 |
| 0.7319444444444444 | 0 |
| 0.7326388888888888 | 0 |
| 0.7333333333333334 | 0 |
| 0.7340277777777778 | 0 |
| 0.7347222222222222 | 0 |
| 0.7354166666666666 | 0 |
| 0.7361111111111112 | 0 |
| 0.7368055555555556 | 0 |
| 0.7374999999999999 | 0 |
| 0.7381944444444444 | 0 |
| 0.7388888888888889 | 0 |
| 0.7395833333333334 | 0 |
| 0.7402777777777777 | 0 |
| 0.7409722222222223 | 0 |
| 0.7416666666666667 | 0 |
| 0.7423611111111111 | 0 |
| 0.7430555555555555 | 0 |
| 0.74375 | 0 |
| 0.7444444444444445 | 0 |
| 0.7451388888888889 | 0 |
| 0.7458333333333332 | 0 |
| 0.7465277777777778 | 0 |
| 0.7472222222222222 | 0 |
| 0.7479166666666667 | 0 |
| 0.748611111111111 | 0 |
| 0.7493055555555556 | 0 |
| 0.75 | 0 |
| 0.7506944444444444 | 0 |
| 0.751388888888889 | 0 |
| 0.7520833333333333 | 0 |
| 0.7527777777777778 | 0 |
| 0.7534722222222222 | 0 |
| 0.7541666666666668 | 0 |
| 0.7548611111111111 | 0 |
| 0.7555555555555555 | 0 |
| 0.75625 | 0 |
| 0.7569444444444445 | 0 |
| 0.7576388888888889 | 0 |
| 0.7583333333333333 | 0 |
| 0.7590277777777777 | 0 |
| 0.7597222222222223 | 0 |
| 0.7604166666666666 | 0 |
| 0.7611111111111111 | 0 |
| 0.7618055555555556 | 0 |
| 0.7625000000000001 | 0 |
| 0.7631944444444444 | 0 |
| 0.7638888888888888 | 0 |
| 0.7645833333333334 | 0 |
| 0.7652777777777778 | 0 |
| 0.7659722222222222 | 0 |
| 0.7666666666666666 | 0 |
| 0.7673611111111112 | 0 |
| 0.7680555555555556 | 0 |
| 0.7687499999999999 | 0 |
| 0.7694444444444444 | 0 |
| 0.7701388888888889 | 0 |
| 0.7708333333333334 | 0 |
| 0.7715277777777777 | 0 |
| 0.7722222222222223 | 0 |
| 0.7729166666666667 | 0 |
| 0.7736111111111111 | 0 |
| 0.7743055555555555 | 0 |
| 0.775 | 0 |
| 0.7756944444444445 | 0 |
| 0.7763888888888889 | 0 |
| 0.7770833333333332 | 0 |
| 0.7777777777777778 | 0 |
| 0.7784722222222222 | 0 |
| 0.7791666666666667 | 0 |
| 0.779861111111111 | 0 |
| 0.7805555555555556 | 0 |
| 0.78125 | 0 |
| 0.7819444444444444 | 0 |
| 0.782638888888889 | 0 |
| 0.7833333333333333 | 0 |
| 0.7840277777777778 | 0 |
| 0.7847222222222222 | 0 |
| 0.7854166666666668 | 0 |
| 0.7861111111111111 | 0 |
| 0.7868055555555555 | 0 |
| 0.7875 | 0 |
| 0.7881944444444445 | 0 |
| 0.7888888888888889 | 0 |
| 0.7895833333333333 | 0 |
| 0.7902777777777777 | 0 |
| 0.7909722222222223 | 0 |
| 0.7916666666666666 | 0 |
| 0.7923611111111111 | 0 |
| 0.7930555555555556 | 0 |
| 0.7937500000000001 | 0 |
| 0.7944444444444444 | 0 |
| 0.7951388888888888 | 0 |
| 0.7958333333333334 | 0 |
| 0.7965277777777778 | 0 |
| 0.7972222222222222 | 0 |
| 0.7979166666666666 | 0 |
| 0.7986111111111112 | 0 |
| 0.7993055555555556 | 0 |
| 0.7999999999999999 | 0 |
| 0.8006944444444444 | 0 |
| 0.8013888888888889 | 0 |
| 0.8020833333333334 | 0 |
| 0.8027777777777777 | 0 |
| 0.8034722222222223 | 0 |
| 0.8041666666666667 | 0 |
| 0.8048611111111111 | 0 |
| 0.8055555555555555 | 0 |
| 0.80625 | 0 |
| 0.8069444444444445 | 0 |
| 0.8076388888888889 | 0 |
| 0.8083333333333332 | 0 |
| 0.8090277777777778 | 0 |
| 0.8097222222222222 | 0 |
| 0.8104166666666667 | 0 |
| 0.811111111111111 | 0 |
| 0.8118055555555556 | 0 |
| 0.8125 | 0 |
| 0.8131944444444444 | 0 |
| 0.813888888888889 | 0 |
| 0.8145833333333333 | 0 |
| 0.8152777777777778 | 0 |
| 0.8159722222222222 | 0 |
| 0.8166666666666668 | 0 |
| 0.8173611111111111 | 0 |
| 0.8180555555555555 | 0 |
| 0.81875 | 0 |
| 0.8194444444444445 | 0 |
| 0.8201388888888889 | 0 |
| 0.8208333333333333 | 0 |
| 0.8215277777777777 | 0 |
| 0.8222222222222223 | 0 |
| 0.8229166666666666 | 0 |
| 0.8236111111111111 | 0 |
| 0.8243055555555556 | 0 |
| 0.8250000000000001 | 0 |
| 0.8256944444444444 | 0 |
| 0.8263888888888888 | 0 |
| 0.8270833333333334 | 0 |
| 0.8277777777777778 | 0 |
| 0.8284722222222222 | 0 |
| 0.8291666666666666 | 0 |
| 0.8298611111111112 | 0 |
| 0.8305555555555556 | 0 |
| 0.8312499999999999 | 0 |
| 0.8319444444444444 | 0 |
| 0.8326388888888889 | 0 |
| 0.8333333333333334 | 0 |
| 0.8340277777777777 | 0 |
| 0.8347222222222223 | 0 |
| 0.8354166666666667 | 0 |
| 0.8361111111111111 | 0 |
| 0.8368055555555555 | 0 |
| 0.8375 | 0 |
| 0.8381944444444445 | 0 |
| 0.8388888888888889 | 0 |
| 0.8395833333333332 | 0 |
| 0.8402777777777778 | 0 |
| 0.8409722222222222 | 0 |
| 0.8416666666666667 | 0 |
| 0.842361111111111 | 0 |
| 0.8430555555555556 | 0 |
| 0.84375 | 0 |
| 0.8444444444444444 | 0 |
| 0.845138888888889 | 0 |
| 0.8458333333333333 | 0 |
| 0.8465277777777778 | 0 |
| 0.8472222222222222 | 0 |
| 0.8479166666666668 | 0 |
| 0.8486111111111111 | 0 |
| 0.8493055555555555 | 0 |
| 0.85 | 0 |
| 0.8506944444444445 | 0 |
| 0.8513888888888889 | 0 |
| 0.8520833333333333 | 0 |
| 0.8527777777777777 | 0 |
| 0.8534722222222223 | 0 |
| 0.8541666666666666 | 0 |
| 0.8548611111111111 | 0 |
| 0.8555555555555556 | 0 |
| 0.8562500000000001 | 0 |
| 0.8569444444444444 | 0 |
| 0.8576388888888888 | 0 |
| 0.8583333333333334 | 0 |
| 0.8590277777777778 | 0 |
| 0.8597222222222222 | 0 |
| 0.8604166666666666 | 0 |
| 0.8611111111111112 | 0 |
| 0.8618055555555556 | 0 |
| 0.8624999999999999 | 0 |
| 0.8631944444444444 | 0 |
| 0.8638888888888889 | 0 |
| 0.8645833333333334 | 0 |
| 0.8652777777777777 | 0 |
| 0.8659722222222223 | 0 |
| 0.8666666666666667 | 0 |
| 0.8673611111111111 | 0 |
| 0.8680555555555555 | 0 |
| 0.86875 | 0 |
| 0.8694444444444445 | 0 |
| 0.8701388888888889 | 0 |
| 0.8708333333333332 | 0 |
| 0.8715277777777778 | 0 |
| 0.8722222222222222 | 0 |
| 0.8729166666666667 | 0 |
| 0.873611111111111 | 0 |
| 0.8743055555555556 | 0 |
| 0.875 | 0 |
| 0.8756944444444444 | 0 |
| 0.876388888888889 | 0 |
| 0.8770833333333333 | 0 |
| 0.8777777777777778 | 0 |
| 0.8784722222222222 | 0 |
| 0.8791666666666668 | 0 |
| 0.8798611111111111 | 0 |
| 0.8805555555555555 | 0 |
| 0.88125 | 0 |
| 0.8819444444444445 | 0 |
| 0.8826388888888889 | 0 |
| 0.8833333333333333 | 0 |
| 0.8840277777777777 | 0 |
| 0.8847222222222223 | 0 |
| 0.8854166666666666 | 0 |
| 0.8861111111111111 | 0 |
| 0.8868055555555556 | 0 |
| 0.8875000000000001 | 0 |
| 0.8881944444444444 | 0 |
| 0.8888888888888888 | 0 |
| 0.8895833333333334 | 0 |
| 0.8902777777777778 | 0 |
| 0.8909722222222222 | 0 |
| 0.8916666666666666 | 0 |
| 0.8923611111111112 | 0 |
| 0.8930555555555556 | 0 |
| 0.8937499999999999 | 0 |
| 0.8944444444444444 | 0 |
| 0.8951388888888889 | 0 |
| 0.8958333333333334 | 0 |
| 0.8965277777777777 | 0 |
| 0.8972222222222223 | 0 |
| 0.8979166666666667 | 0 |
| 0.8986111111111111 | 0 |
| 0.8993055555555555 | 0 |
| 0.9 | 0 |
| 0.9006944444444445 | 0 |
| 0.9013888888888889 | 0 |
| 0.9020833333333332 | 0 |
| 0.9027777777777778 | 0 |
| 0.9034722222222222 | 0 |
| 0.9041666666666667 | 0 |
| 0.904861111111111 | 0 |
| 0.9055555555555556 | 0 |
| 0.90625 | 0 |
| 0.9069444444444444 | 0 |
| 0.907638888888889 | 0 |
| 0.9083333333333333 | 0 |
| 0.9090277777777778 | 0 |
| 0.9097222222222222 | 0 |
| 0.9104166666666668 | 0 |
| 0.9111111111111111 | 0 |
| 0.9118055555555555 | 0 |
| 0.9125 | 0 |
| 0.9131944444444445 | 0 |
| 0.9138888888888889 | 0 |
| 0.9145833333333333 | 0 |
| 0.9152777777777777 | 0 |
| 0.9159722222222223 | 0 |
| 0.9166666666666666 | 0 |
| 0.9173611111111111 | 0 |
| 0.9180555555555556 | 0 |
| 0.9187500000000001 | 0 |
| 0.9194444444444444 | 0 |
| 0.9201388888888888 | 0 |
| 0.9208333333333334 | 0 |
| 0.9215277777777778 | 0 |
| 0.9222222222222222 | 0 |
| 0.9229166666666666 | 0 |
| 0.9236111111111112 | 0 |
| 0.9243055555555556 | 0 |
| 0.9249999999999999 | 0 |
| 0.9256944444444444 | 0 |
| 0.9263888888888889 | 0 |
| 0.9270833333333334 | 0 |
| 0.9277777777777777 | 0 |
| 0.9284722222222223 | 0 |
| 0.9291666666666667 | 0 |
| 0.9298611111111111 | 0 |
| 0.9305555555555555 | 0 |
| 0.93125 | 0 |
| 0.9319444444444445 | 0 |
| 0.9326388888888889 | 0 |
| 0.9333333333333332 | 0 |
| 0.9340277777777778 | 0 |
| 0.9347222222222222 | 0 |
| 0.9354166666666667 | 0 |
| 0.936111111111111 | 0 |
| 0.9368055555555556 | 0 |
| 0.9375 | 0 |
| 0.9381944444444444 | 0 |
| 0.938888888888889 | 0 |
| 0.9395833333333333 | 0 |
| 0.9402777777777778 | 0 |
| 0.9409722222222222 | 0 |
| 0.9416666666666668 | 0 |
| 0.9423611111111111 | 0 |
| 0.9430555555555555 | 0 |
| 0.94375 | 0 |
| 0.9444444444444445 | 0 |
| 0.9451388888888889 | 0 |
| 0.9458333333333333 | 0 |
| 0.9465277777777777 | 0 |
| 0.9472222222222223 | 0 |
| 0.9479166666666666 | 0 |
| 0.9486111111111111 | 0 |
| 0.9493055555555556 | 0 |
| 0.9500000000000001 | 0 |
| 0.9506944444444444 | 0 |
| 0.9513888888888888 | 0 |
| 0.9520833333333334 | 0 |
| 0.9527777777777778 | 0 |
| 0.9534722222222222 | 0 |
| 0.9541666666666666 | 0 |
| 0.9548611111111112 | 0 |
| 0.9555555555555556 | 0 |
| 0.9562499999999999 | 0 |
| 0.9569444444444444 | 0 |
| 0.9576388888888889 | 0 |
| 0.9583333333333334 | 0 |
| 0.9590277777777777 | 0 |
| 0.9597222222222223 | 0 |
| 0.9604166666666667 | 0 |
| 0.9611111111111111 | 0 |
| 0.9618055555555555 | 0 |
| 0.9625 | 0 |
| 0.9631944444444445 | 0 |
| 0.9638888888888889 | 0 |
| 0.9645833333333332 | 0 |
| 0.9652777777777778 | 0 |
| 0.9659722222222222 | 0 |
| 0.9666666666666667 | 0 |
| 0.967361111111111 | 0 |
| 0.9680555555555556 | 0 |
| 0.96875 | 0 |
| 0.9694444444444444 | 0 |
| 0.970138888888889 | 0 |
| 0.9708333333333333 | 0 |
| 0.9715277777777778 | 0 |
| 0.9722222222222222 | 0 |
| 0.9729166666666668 | 0 |
| 0.9736111111111111 | 0 |
| 0.9743055555555555 | 0 |
| 0.975 | 0 |
| 0.9756944444444445 | 0 |
| 0.9763888888888889 | 0 |
| 0.9770833333333333 | 0 |
| 0.9777777777777777 | 0 |
| 0.9784722222222223 | 0 |
| 0.9791666666666666 | 0 |
| 0.9798611111111111 | 0 |
| 0.9805555555555556 | 0 |
| 0.9812500000000001 | 0 |
| 0.9819444444444444 | 0 |
| 0.9826388888888888 | 0 |
| 0.9833333333333334 | 0 |
| 0.9840277777777778 | 0 |
| 0.9847222222222222 | 0 |
| 0.9854166666666666 | 0 |
| 0.9861111111111112 | 0 |
| 0.9868055555555556 | 0 |
| 0.9874999999999999 | 0 |
| 0.9881944444444444 | 0 |
| 0.9888888888888889 | 0 |
| 0.9895833333333334 | 0 |
| 0.9902777777777777 | 0 |
| 0.9909722222222223 | 0 |
| 0.9916666666666667 | 0 |
| 0.9923611111111111 | 0 |
| 0.9930555555555555 | 0 |
| 0.99375 | 0 |
| 0.9944444444444445 | 0 |
| 0.9951388888888889 | 0 |
| 0.9958333333333332 | 0 |
| 0.9965277777777778 | 0 |
| 0.9972222222222222 | 0 |
| 0.9979166666666667 | 0 |
| 0.998611111111111 | 0 |
| 0.9993055555555556 | 0 |